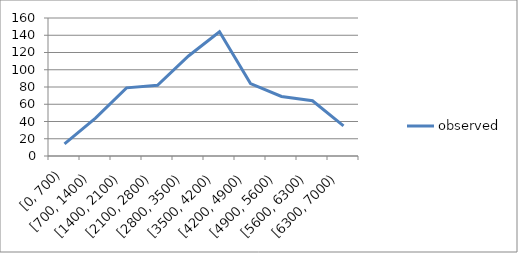
| Category | observed |
|---|---|
| [0, 700) | 14 |
| [700, 1400) | 44 |
| [1400, 2100) | 79 |
| [2100, 2800) | 82 |
| [2800, 3500) | 116 |
| [3500, 4200) | 144 |
| [4200, 4900) | 84 |
| [4900, 5600) | 69 |
| [5600, 6300) | 64 |
| [6300, 7000) | 35 |